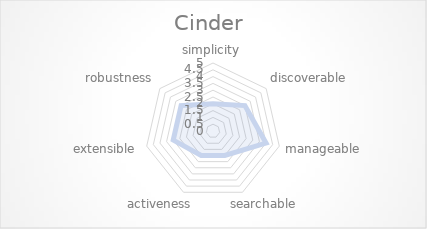
| Category | Cinder |
|---|---|
| simplicity | 2 |
| discoverable | 3 |
| manageable | 4 |
| searchable | 2 |
| activeness | 2 |
| extensible | 3 |
| robustness | 3 |